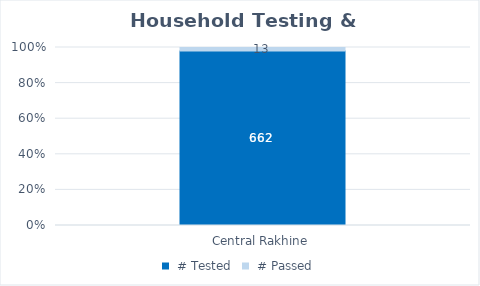
| Category |  # Tested |  # Passed |
|---|---|---|
| Central Rakhine | 662 | 13 |